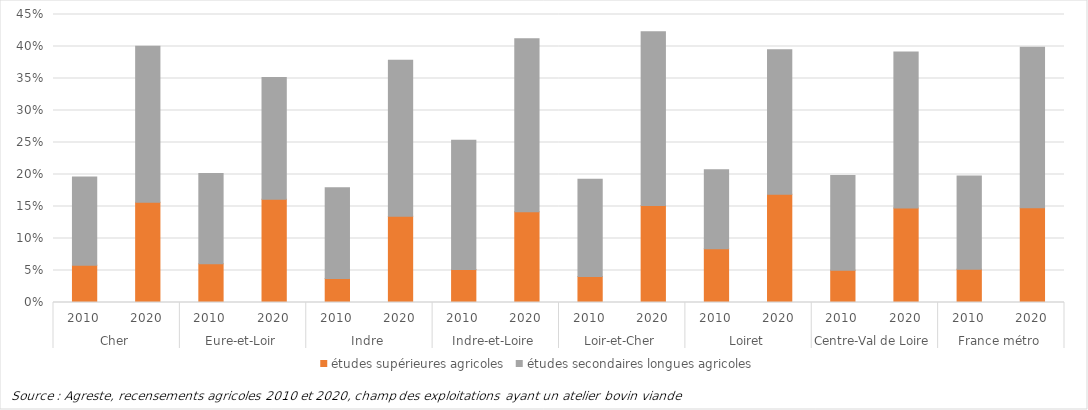
| Category | études supérieures agricoles | études secondaires longues agricoles |
|---|---|---|
| 0 | 0.058 | 0.138 |
| 1 | 0.157 | 0.244 |
| 2 | 0.061 | 0.141 |
| 3 | 0.161 | 0.19 |
| 4 | 0.038 | 0.142 |
| 5 | 0.135 | 0.244 |
| 6 | 0.052 | 0.202 |
| 7 | 0.142 | 0.27 |
| 8 | 0.041 | 0.152 |
| 9 | 0.152 | 0.271 |
| 10 | 0.084 | 0.123 |
| 11 | 0.169 | 0.226 |
| 12 | 0.05 | 0.148 |
| 13 | 0.148 | 0.244 |
| 14 | 0.052 | 0.146 |
| 15 | 0.148 | 0.251 |